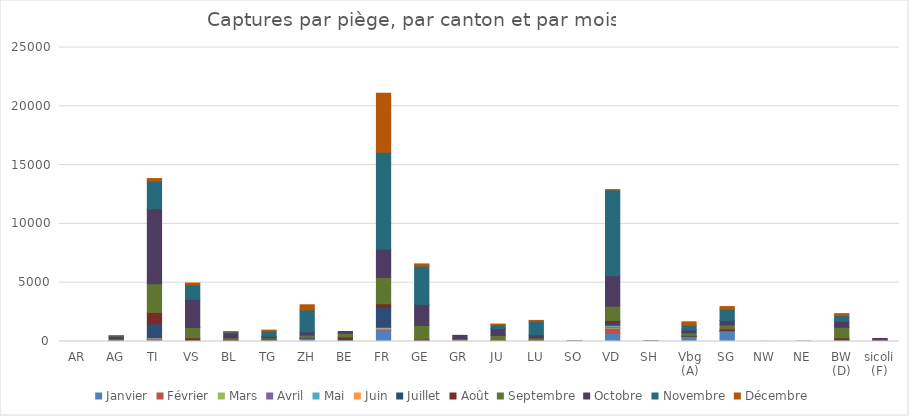
| Category | Janvier | Février | Mars | Avril | Mai | Juin | Juillet | Août | Septembre | Octobre | Novembre | Décembre |
|---|---|---|---|---|---|---|---|---|---|---|---|---|
| AR | 0 | 0 | 0 | 0 | 0 | 0 | 0 | 0 | 0 | 0 | 0 | 0 |
| AG | 16.25 | 0 | 0.8 | 2.533 | 4.2 | 3.733 | 30.903 | 45.524 | 130.035 | 189.643 | 57.333 | 8 |
| TI | 137.8 | 20.8 | 27.4 | 95.4 | 18 | 34 | 1159.6 | 982 | 2430.4 | 6385.333 | 2344.833 | 220.167 |
| VS | 35.833 | 0.279 | 0.066 | 3.696 | 3 | 1.269 | 37.064 | 222.488 | 885.333 | 2402.4 | 1232.444 | 146 |
| BL | 0 | 0 | 0 | 1.625 | 1.333 | 6.727 | 110.5 | 52.7 | 150.5 | 391.5 | 106.27 | 9.667 |
| TG | 120 | 0 | 0.556 | 0 | 0.667 | 0.462 | 12.554 | 57.984 | 120.36 | 130.886 | 440 | 82 |
| ZH | 261.61 | 0.308 | 0.741 | 2.407 | 1.056 | 3.371 | 45.326 | 29.84 | 199.518 | 278.008 | 1859.167 | 440.711 |
| BE | 3.529 | 0.25 | 1.111 | 9.286 | 6 | 13.6 | 156.48 | 199.357 | 314.275 | 144 | 0 | 0 |
| FR | 923.333 | 0 | 0 | 106.364 | 109.333 | 67.5 | 1710.833 | 292.667 | 2242.5 | 2382.5 | 8252 | 5031 |
| GE | 0 | 0 | 0 | 25.455 | 15.833 | 11.25 | 60.656 | 88.923 | 1166.154 | 1786.731 | 3255 | 188 |
| GR | 0 | 0 | 0 | 0 | 0 | 0 | 0 | 61.391 | 182.167 | 277.857 | 0 | 0 |
| JU | 24 | 1 | 1 | 0 | 0.667 | 11 | 35 | 41.5 | 402 | 600 | 312.5 | 56 |
| LU | 0 | 48 | 1 | 0.75 | 0 | 1.333 | 25.484 | 54.923 | 172.828 | 261.042 | 1159 | 68.5 |
| SO | 0.625 | 0 | 0 | 0.625 | 0.5 | 5.75 | 8.25 | 13.75 | 12 | 0 | 0 | 0 |
| VD | 694.286 | 419 | 51 | 96.667 | 67.122 | 45.488 | 255.804 | 160.372 | 1216.966 | 2584.333 | 7296 | 22 |
| SH | 0 | 0 | 0 | 0 | 0 | 0 | 1.912 | 2.118 | 15.631 | 30.714 | 0 | 0 |
| Vbg (A) | 415 | 2 | 0 | 0 | 0 | 2.154 | 28.125 | 41.882 | 253.111 | 229.167 | 422.667 | 280 |
| SG | 884.318 | 0 | 1 | 1.416 | 0.293 | 0.615 | 43.544 | 141.5 | 343.286 | 362.018 | 979.402 | 213.286 |
| NW | 0 | 0 | 0 | 5 | 0 | 5 | 0 | 0 | 0 | 0 | 0 | 0 |
| NE | 0 | 0 | 0 | 0 | 0 | 0 | 0.833 | 7.333 | 19 | 0 | 0 | 0 |
| BW (D) | 90.64 | 0 | 0.24 | 0.388 | 2.899 | 3.718 | 36.158 | 173.214 | 898.909 | 497.326 | 496.071 | 172.28 |
| sicoli (F) | 34.786 | 0.214 | 3.357 | 1.686 | 1.636 | 7.725 | 60.617 | 41.766 | 37.556 | 69.625 | 0 | 0 |